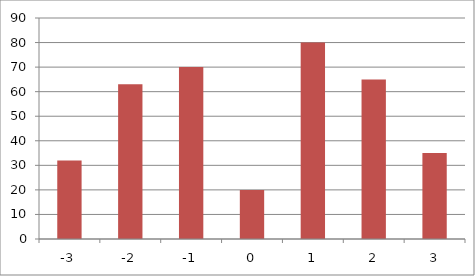
| Category | Number of Days |
|---|---|
| -3.0 | 32 |
| -2.0 | 63 |
| -1.0 | 70 |
| 0.0 | 20 |
| 1.0 | 80 |
| 2.0 | 65 |
| 3.0 | 35 |